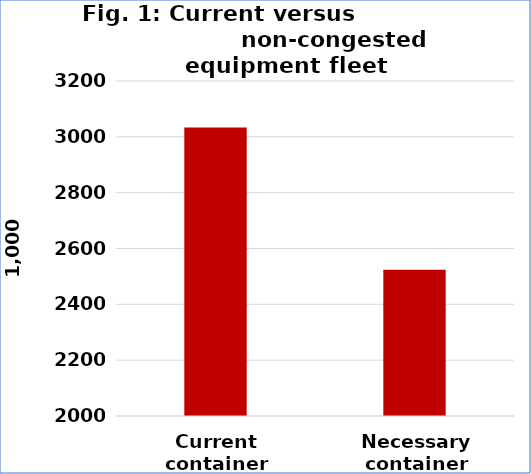
| Category | Series 0 |
|---|---|
| Current container capacity | 3033 |
| Necessary container capacity | 2523.541 |